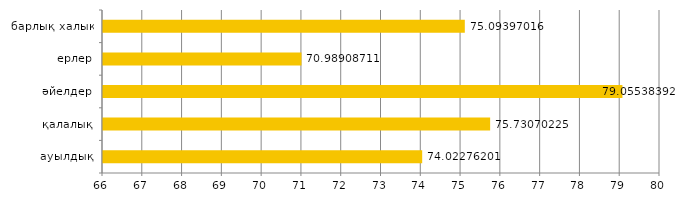
| Category | Series 0 |
|---|---|
| ауылдық | 74.023 |
| қалалық | 75.731 |
| әйелдер | 79.055 |
| ерлер | 70.989 |
| барлық халық | 75.094 |